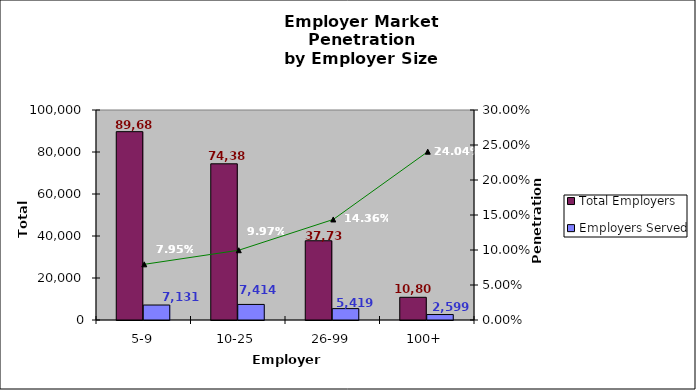
| Category | Total Employers | Employers Served |
|---|---|---|
| 5-9 | 89682 | 7131 |
| 10-25 | 74382 | 7414 |
| 26-99 | 37731 | 5419 |
| 100+ | 10809 | 2599 |